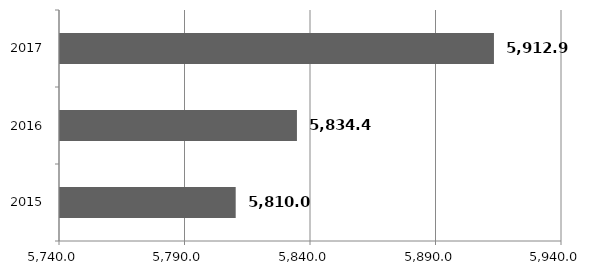
| Category | Series 0 |
|---|---|
| 2015.0 | 5810 |
| 2016.0 | 5834.4 |
| 2017.0 | 5912.89 |